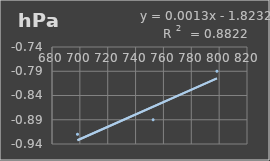
| Category | Presión Admosferica |
|---|---|
| 698.3 | -0.92 |
| 752.6 | -0.89 |
| 798.4 | -0.79 |